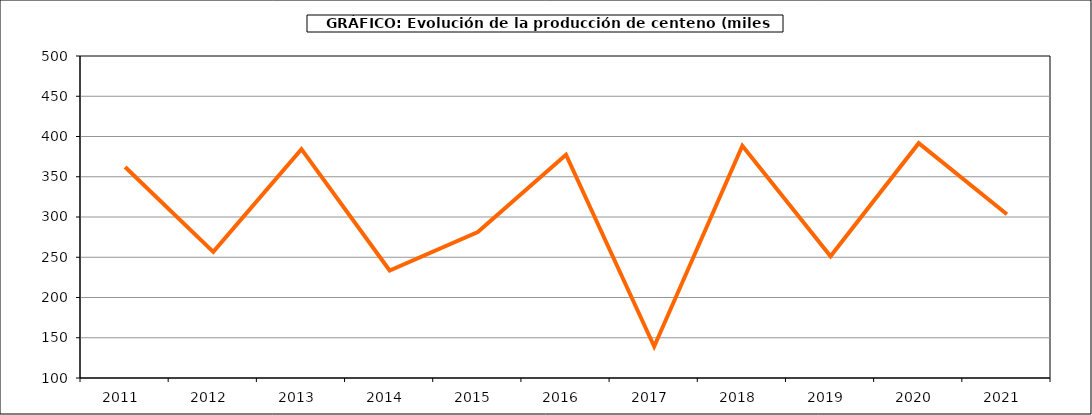
| Category | Producción |
|---|---|
| 2011.0 | 362.08 |
| 2012.0 | 256.675 |
| 2013.0 | 384.339 |
| 2014.0 | 233.542 |
| 2015.0 | 281.366 |
| 2016.0 | 377.355 |
| 2017.0 | 139.178 |
| 2018.0 | 388.467 |
| 2019.0 | 251.324 |
| 2020.0 | 391.68 |
| 2021.0 | 303.403 |